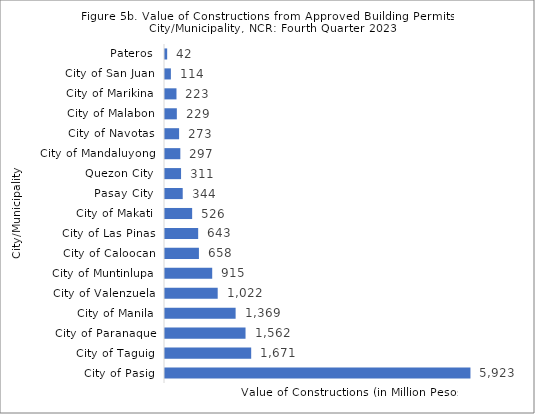
| Category | Series 0 |
|---|---|
|   City of Pasig  | 5922.812 |
|   City of Taguig  | 1671.325 |
|   City of Paranaque  | 1561.561 |
|   City of Manila  | 1369.449 |
|   City of Valenzuela  | 1021.881 |
|   City of Muntinlupa  | 915.476 |
|   City of Caloocan  | 657.87 |
|   City of Las Pinas  | 643.324 |
|   City of Makati  | 526.493 |
|   Pasay City  | 343.628 |
|   Quezon City  | 311.478 |
|   City of Mandaluyong  | 297.333 |
|   City of Navotas  | 273.362 |
|   City of Malabon  | 229.477 |
|   City of Marikina  | 222.662 |
|   City of San Juan  | 114.282 |
|   Pateros  | 42.187 |